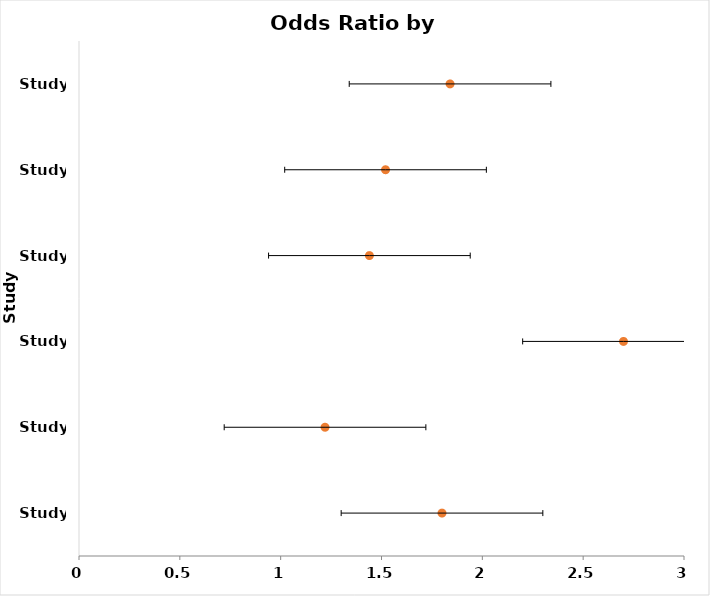
| Category | Odds Ratio |
|---|---|
| Study 1 | 1.8 |
| Study 2 | 1.22 |
| Study 3 | 2.7 |
| Study 4 | 1.44 |
| Study 5 | 1.52 |
| Study 6 | 1.84 |